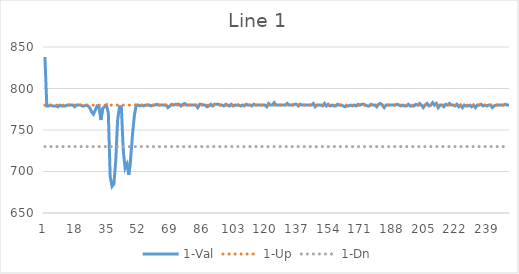
| Category | 1-Val | 1-Up | 1-Dn |
|---|---|---|---|
| 0 | 838 | 780 | 730 |
| 1 | 779 | 780 | 730 |
| 2 | 779 | 780 | 730 |
| 3 | 780 | 780 | 730 |
| 4 | 779 | 780 | 730 |
| 5 | 779 | 780 | 730 |
| 6 | 779 | 780 | 730 |
| 7 | 778 | 780 | 730 |
| 8 | 780 | 780 | 730 |
| 9 | 779 | 780 | 730 |
| 10 | 779 | 780 | 730 |
| 11 | 779 | 780 | 730 |
| 12 | 780 | 780 | 730 |
| 13 | 780 | 780 | 730 |
| 14 | 780 | 780 | 730 |
| 15 | 780 | 780 | 730 |
| 16 | 778 | 780 | 730 |
| 17 | 780 | 780 | 730 |
| 18 | 780 | 780 | 730 |
| 19 | 780 | 780 | 730 |
| 20 | 779 | 780 | 730 |
| 21 | 779 | 780 | 730 |
| 22 | 780 | 780 | 730 |
| 23 | 779 | 780 | 730 |
| 24 | 777 | 780 | 730 |
| 25 | 772 | 780 | 730 |
| 26 | 769 | 780 | 730 |
| 27 | 774 | 780 | 730 |
| 28 | 779 | 780 | 730 |
| 29 | 778 | 780 | 730 |
| 30 | 762 | 780 | 730 |
| 31 | 776 | 780 | 730 |
| 32 | 778 | 780 | 730 |
| 33 | 780 | 780 | 730 |
| 34 | 771 | 780 | 730 |
| 35 | 694 | 780 | 730 |
| 36 | 682 | 780 | 730 |
| 37 | 685 | 780 | 730 |
| 38 | 713 | 780 | 730 |
| 39 | 762 | 780 | 730 |
| 40 | 778 | 780 | 730 |
| 41 | 778 | 780 | 730 |
| 42 | 726 | 780 | 730 |
| 43 | 704 | 780 | 730 |
| 44 | 709 | 780 | 730 |
| 45 | 696 | 780 | 730 |
| 46 | 716 | 780 | 730 |
| 47 | 745 | 780 | 730 |
| 48 | 768 | 780 | 730 |
| 49 | 780 | 780 | 730 |
| 50 | 780 | 780 | 730 |
| 51 | 779 | 780 | 730 |
| 52 | 780 | 780 | 730 |
| 53 | 779 | 780 | 730 |
| 54 | 780 | 780 | 730 |
| 55 | 780 | 780 | 730 |
| 56 | 780 | 780 | 730 |
| 57 | 779 | 780 | 730 |
| 58 | 780 | 780 | 730 |
| 59 | 780 | 780 | 730 |
| 60 | 781 | 780 | 730 |
| 61 | 780 | 780 | 730 |
| 62 | 780 | 780 | 730 |
| 63 | 780 | 780 | 730 |
| 64 | 780 | 780 | 730 |
| 65 | 780 | 780 | 730 |
| 66 | 777 | 780 | 730 |
| 67 | 779 | 780 | 730 |
| 68 | 781 | 780 | 730 |
| 69 | 780 | 780 | 730 |
| 70 | 781 | 780 | 730 |
| 71 | 781 | 780 | 730 |
| 72 | 781 | 780 | 730 |
| 73 | 779 | 780 | 730 |
| 74 | 781 | 780 | 730 |
| 75 | 782 | 780 | 730 |
| 76 | 780 | 780 | 730 |
| 77 | 780 | 780 | 730 |
| 78 | 780 | 780 | 730 |
| 79 | 780 | 780 | 730 |
| 80 | 780 | 780 | 730 |
| 81 | 780 | 780 | 730 |
| 82 | 777 | 780 | 730 |
| 83 | 781 | 780 | 730 |
| 84 | 781 | 780 | 730 |
| 85 | 780 | 780 | 730 |
| 86 | 780 | 780 | 730 |
| 87 | 778 | 780 | 730 |
| 88 | 779 | 780 | 730 |
| 89 | 781 | 780 | 730 |
| 90 | 779 | 780 | 730 |
| 91 | 781 | 780 | 730 |
| 92 | 781 | 780 | 730 |
| 93 | 781 | 780 | 730 |
| 94 | 780 | 780 | 730 |
| 95 | 780 | 780 | 730 |
| 96 | 779 | 780 | 730 |
| 97 | 781 | 780 | 730 |
| 98 | 780 | 780 | 730 |
| 99 | 779 | 780 | 730 |
| 100 | 781 | 780 | 730 |
| 101 | 779 | 780 | 730 |
| 102 | 780 | 780 | 730 |
| 103 | 780 | 780 | 730 |
| 104 | 780 | 780 | 730 |
| 105 | 779 | 780 | 730 |
| 106 | 780 | 780 | 730 |
| 107 | 779 | 780 | 730 |
| 108 | 781 | 780 | 730 |
| 109 | 780 | 780 | 730 |
| 110 | 780 | 780 | 730 |
| 111 | 779 | 780 | 730 |
| 112 | 781 | 780 | 730 |
| 113 | 780 | 780 | 730 |
| 114 | 780 | 780 | 730 |
| 115 | 780 | 780 | 730 |
| 116 | 780 | 780 | 730 |
| 117 | 780 | 780 | 730 |
| 118 | 780 | 780 | 730 |
| 119 | 778 | 780 | 730 |
| 120 | 782 | 780 | 730 |
| 121 | 780 | 780 | 730 |
| 122 | 780 | 780 | 730 |
| 123 | 783 | 780 | 730 |
| 124 | 780 | 780 | 730 |
| 125 | 780 | 780 | 730 |
| 126 | 780 | 780 | 730 |
| 127 | 780 | 780 | 730 |
| 128 | 780 | 780 | 730 |
| 129 | 780 | 780 | 730 |
| 130 | 782 | 780 | 730 |
| 131 | 780 | 780 | 730 |
| 132 | 780 | 780 | 730 |
| 133 | 780 | 780 | 730 |
| 134 | 781 | 780 | 730 |
| 135 | 781 | 780 | 730 |
| 136 | 779 | 780 | 730 |
| 137 | 781 | 780 | 730 |
| 138 | 780 | 780 | 730 |
| 139 | 780 | 780 | 730 |
| 140 | 780 | 780 | 730 |
| 141 | 780 | 780 | 730 |
| 142 | 780 | 780 | 730 |
| 143 | 780 | 780 | 730 |
| 144 | 782 | 780 | 730 |
| 145 | 778 | 780 | 730 |
| 146 | 780 | 780 | 730 |
| 147 | 780 | 780 | 730 |
| 148 | 780 | 780 | 730 |
| 149 | 779 | 780 | 730 |
| 150 | 782 | 780 | 730 |
| 151 | 779 | 780 | 730 |
| 152 | 781 | 780 | 730 |
| 153 | 779 | 780 | 730 |
| 154 | 780 | 780 | 730 |
| 155 | 779 | 780 | 730 |
| 156 | 779 | 780 | 730 |
| 157 | 781 | 780 | 730 |
| 158 | 780 | 780 | 730 |
| 159 | 780 | 780 | 730 |
| 160 | 779 | 780 | 730 |
| 161 | 778 | 780 | 730 |
| 162 | 779 | 780 | 730 |
| 163 | 779 | 780 | 730 |
| 164 | 780 | 780 | 730 |
| 165 | 779 | 780 | 730 |
| 166 | 780 | 780 | 730 |
| 167 | 779 | 780 | 730 |
| 168 | 781 | 780 | 730 |
| 169 | 780 | 780 | 730 |
| 170 | 781 | 780 | 730 |
| 171 | 781 | 780 | 730 |
| 172 | 780 | 780 | 730 |
| 173 | 779 | 780 | 730 |
| 174 | 779 | 780 | 730 |
| 175 | 781 | 780 | 730 |
| 176 | 780 | 780 | 730 |
| 177 | 780 | 780 | 730 |
| 178 | 778 | 780 | 730 |
| 179 | 781 | 780 | 730 |
| 180 | 782 | 780 | 730 |
| 181 | 780 | 780 | 730 |
| 182 | 777 | 780 | 730 |
| 183 | 780 | 780 | 730 |
| 184 | 780 | 780 | 730 |
| 185 | 780 | 780 | 730 |
| 186 | 780 | 780 | 730 |
| 187 | 780 | 780 | 730 |
| 188 | 780 | 780 | 730 |
| 189 | 781 | 780 | 730 |
| 190 | 780 | 780 | 730 |
| 191 | 779 | 780 | 730 |
| 192 | 780 | 780 | 730 |
| 193 | 779 | 780 | 730 |
| 194 | 779 | 780 | 730 |
| 195 | 781 | 780 | 730 |
| 196 | 779 | 780 | 730 |
| 197 | 779 | 780 | 730 |
| 198 | 779 | 780 | 730 |
| 199 | 781 | 780 | 730 |
| 200 | 780 | 780 | 730 |
| 201 | 782 | 780 | 730 |
| 202 | 780 | 780 | 730 |
| 203 | 777 | 780 | 730 |
| 204 | 780 | 780 | 730 |
| 205 | 782 | 780 | 730 |
| 206 | 779 | 780 | 730 |
| 207 | 780 | 780 | 730 |
| 208 | 783 | 780 | 730 |
| 209 | 780 | 780 | 730 |
| 210 | 782 | 780 | 730 |
| 211 | 777 | 780 | 730 |
| 212 | 780 | 780 | 730 |
| 213 | 780 | 780 | 730 |
| 214 | 778 | 780 | 730 |
| 215 | 781 | 780 | 730 |
| 216 | 780 | 780 | 730 |
| 217 | 782 | 780 | 730 |
| 218 | 780 | 780 | 730 |
| 219 | 780 | 780 | 730 |
| 220 | 779 | 780 | 730 |
| 221 | 781 | 780 | 730 |
| 222 | 778 | 780 | 730 |
| 223 | 780 | 780 | 730 |
| 224 | 777 | 780 | 730 |
| 225 | 780 | 780 | 730 |
| 226 | 779 | 780 | 730 |
| 227 | 779 | 780 | 730 |
| 228 | 780 | 780 | 730 |
| 229 | 778 | 780 | 730 |
| 230 | 780 | 780 | 730 |
| 231 | 777 | 780 | 730 |
| 232 | 780 | 780 | 730 |
| 233 | 780 | 780 | 730 |
| 234 | 781 | 780 | 730 |
| 235 | 779 | 780 | 730 |
| 236 | 780 | 780 | 730 |
| 237 | 779 | 780 | 730 |
| 238 | 780 | 780 | 730 |
| 239 | 780 | 780 | 730 |
| 240 | 777 | 780 | 730 |
| 241 | 779 | 780 | 730 |
| 242 | 780 | 780 | 730 |
| 243 | 780 | 780 | 730 |
| 244 | 780 | 780 | 730 |
| 245 | 780 | 780 | 730 |
| 246 | 780 | 780 | 730 |
| 247 | 781 | 780 | 730 |
| 248 | 780 | 780 | 730 |
| 249 | 780 | 780 | 730 |